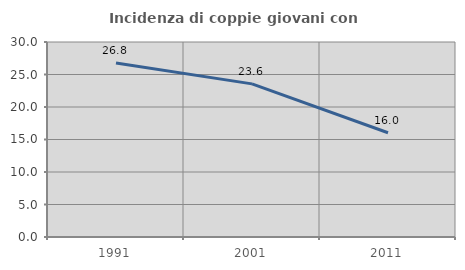
| Category | Incidenza di coppie giovani con figli |
|---|---|
| 1991.0 | 26.761 |
| 2001.0 | 23.557 |
| 2011.0 | 16.04 |